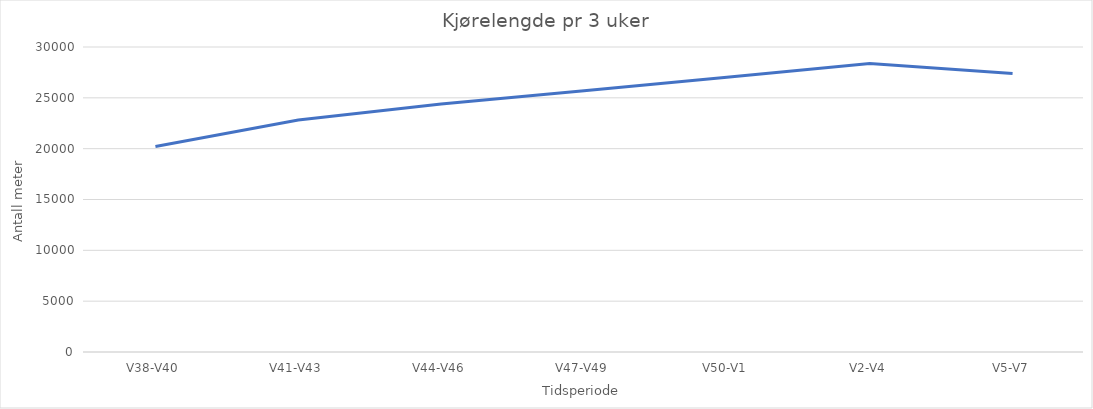
| Category | Kjørelengde pr 3 uker |
|---|---|
| V38-V40 | 20204.407 |
| V41-V43 | 22812.719 |
| V44-V46 | 24394.399 |
| V47-V49 | 25702.315 |
| V50-V1 | 27027.165 |
| V2-V4 | 28384.861 |
| V5-V7 | 27387.024 |